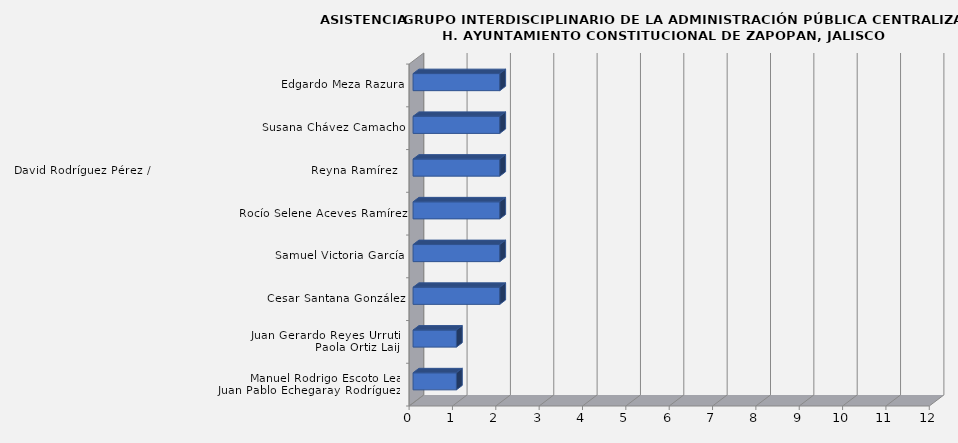
| Category | Series 0 |
|---|---|
| Manuel Rodrigo Escoto Leal/
Juan Pablo Echegaray Rodríguez    | 1 |
| Juan Gerardo Reyes Urrutia/
Paola Ortiz Laija | 1 |
| Cesar Santana González | 2 |
| Samuel Victoria García | 2 |
| Rocío Selene Aceves Ramírez | 2 |
| David Rodríguez Pérez /                                        Reyna Ramírez Corres | 2 |
| Susana Chávez Camacho | 2 |
| Edgardo Meza Razura | 2 |